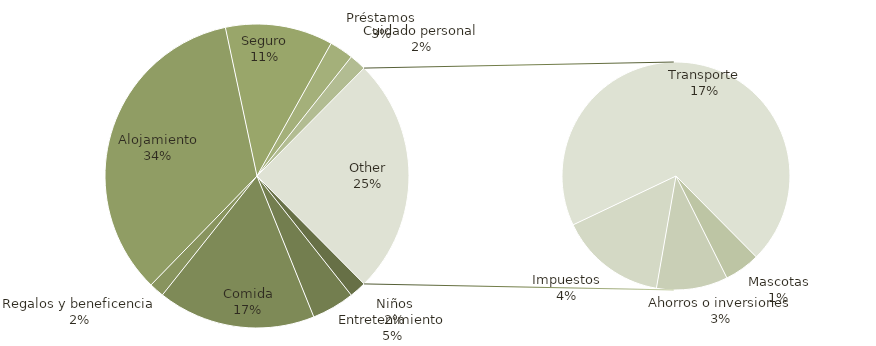
| Category | Total |
|---|---|
| Niños | 140 |
| Entretenimiento | 358 |
| Comida | 1320 |
| Regalos y beneficencia | 125 |
| Alojamiento | 2702 |
| Seguro | 900 |
| Préstamos | 200 |
| Cuidado personal | 140 |
| Mascotas | 100 |
| Ahorros o inversiones | 200 |
| Impuestos | 300 |
| Transporte | 1375 |